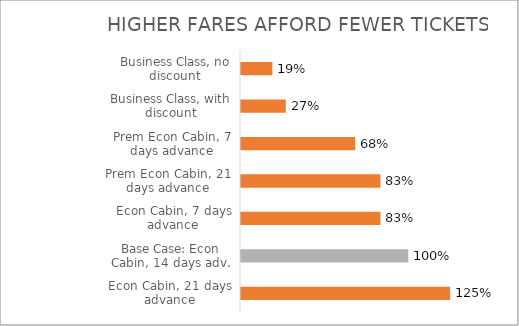
| Category | Tickets as % of Base case |
|---|---|
| Econ Cabin, 21 days advance | 1.25 |
| Base Case: Econ Cabin, 14 days adv. | 1 |
| Econ Cabin, 7 days advance | 0.833 |
| Prem Econ Cabin, 21 days advance | 0.833 |
| Prem Econ Cabin, 7 days advance | 0.682 |
| Business Class, with discount | 0.268 |
| Business Class, no discount | 0.188 |